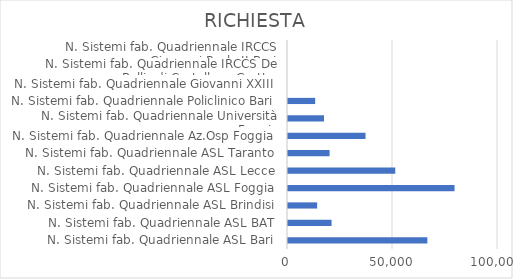
| Category | RICHIESTA |
|---|---|
| N. Sistemi fab. Quadriennale ASL Bari | 66360 |
| N. Sistemi fab. Quadriennale ASL BAT | 20740 |
| N. Sistemi fab. Quadriennale ASL Brindisi | 13880 |
| N. Sistemi fab. Quadriennale ASL Foggia | 79300 |
| N. Sistemi fab. Quadriennale ASL Lecce | 51074 |
| N. Sistemi fab. Quadriennale ASL Taranto | 19810 |
| N. Sistemi fab. Quadriennale Az.Osp Foggia | 36920 |
| N. Sistemi fab. Quadriennale Università Foggia | 17145 |
| N. Sistemi fab. Quadriennale Policlinico Bari | 12934 |
| N. Sistemi fab. Quadriennale Giovanni XXIII | 0 |
| N. Sistemi fab. Quadriennale IRCCS De Bellis di Castellana Grotte | 0 |
| N. Sistemi fab. Quadriennale IRCCS Giovanni Paolo II Bari | 0 |